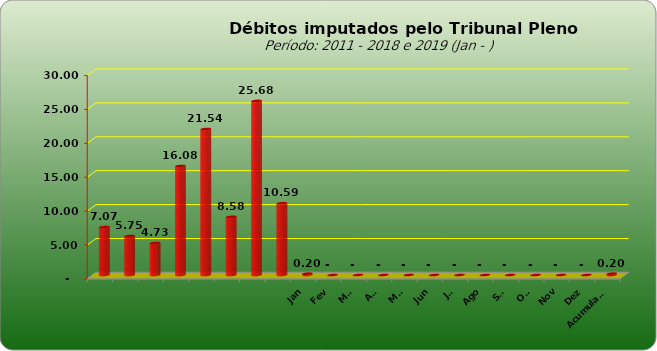
| Category |  7.073.154,74  |
|---|---|
|  | 7073154.74 |
|  | 5749129.25 |
|  | 4727033.51 |
|  | 16081820.48 |
|  | 21535723.6 |
|  | 8578266.09 |
|  | 25676499.17 |
|  | 10590282.73 |
| Jan | 197255.77 |
| Fev | 0 |
| Mar | 0 |
| Abr | 0 |
| Mai | 0 |
| Jun | 0 |
| Jul | 0 |
| Ago | 0 |
| Set | 0 |
| Out | 0 |
| Nov | 0 |
| Dez | 0 |
| Acumulado | 197255.77 |